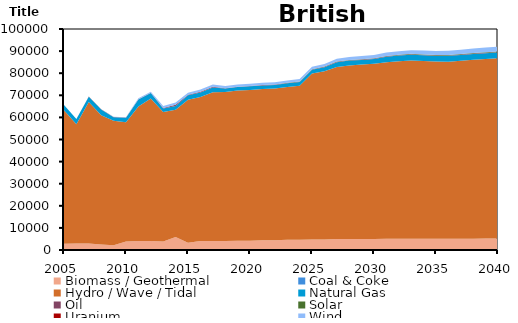
| Category | Biomass / Geothermal | Coal & Coke | Hydro / Wave / Tidal | Natural Gas | Oil | Solar | Uranium | Wind |
|---|---|---|---|---|---|---|---|---|
| 2005.0 | 2863.407 | 0 | 60327 | 2382.917 | 91.056 | 0 | 0 | 0 |
| 2006.0 | 2948.704 | 0 | 53902.91 | 2388.621 | 35.556 | 0 | 0 | 0 |
| 2007.0 | 2948.704 | 0 | 64015.8 | 2388.62 | 91.556 | 0 | 0 | 0 |
| 2008.0 | 2467.383 | 0 | 58525.63 | 2635.125 | 94.568 | 0 | 0 | 0 |
| 2009.0 | 2162.837 | 0 | 56298.4 | 1635.694 | 111.112 | 0 | 0 | 34 |
| 2010.0 | 3810.735 | 0 | 53970.88 | 2089.002 | 107.104 | 0 | 0 | 123 |
| 2011.0 | 4110.999 | 0 | 60772.07 | 3214.862 | 91.712 | 0 | 0 | 484.602 |
| 2012.0 | 4034.091 | 0 | 64477.04 | 2557.922 | 46.184 | 0 | 0 | 507.981 |
| 2013.0 | 3821.901 | 0 | 58666.27 | 1520.026 | 289.309 | 0 | 0 | 860 |
| 2014.0 | 5856.074 | 0 | 57572.87 | 1689.203 | 556.96 | 0 | 0 | 1071.139 |
| 2015.0 | 3275.062 | 0 | 64713.33 | 2050.774 | 196.85 | 0 | 0 | 867.895 |
| 2016.0 | 4030.003 | 0 | 65194.44 | 2077.94 | 304.474 | 0 | 0 | 1058.948 |
| 2017.0 | 4040.525 | 0 | 67340.4 | 2115.704 | 330.782 | 0 | 0 | 1015.417 |
| 2018.0 | 4040.524 | 0 | 67459.69 | 1528.177 | 160.6 | 7.008 | 0 | 1015.417 |
| 2019.0 | 4218.789 | 0 | 68009.38 | 1516.383 | 160.6 | 7.008 | 0 | 1015.417 |
| 2020.0 | 4218.789 | 0 | 68221.81 | 1634.319 | 160.6 | 7.008 | 0 | 1015.417 |
| 2021.0 | 4397.053 | 0 | 68434.27 | 1634.32 | 160.6 | 20.148 | 0 | 1015.417 |
| 2022.0 | 4397.053 | 0 | 68646.69 | 1636.05 | 160.6 | 33.288 | 0 | 1050.457 |
| 2023.0 | 4590.691 | 0 | 69206.12 | 1647.177 | 160.6 | 53.436 | 0 | 1085.497 |
| 2024.0 | 4607.169 | 0 | 69744.25 | 1655.513 | 160.6 | 66.576 | 0 | 1120.537 |
| 2025.0 | 4753.581 | 0 | 75147.2 | 1660.6 | 160.6 | 79.716 | 0 | 1155.577 |
| 2026.0 | 4784.433 | 0 | 76111.87 | 1849.27 | 160.6 | 92.856 | 0 | 1190.617 |
| 2027.0 | 4985.819 | 0 | 77794.23 | 2223.952 | 172.689 | 105.996 | 0 | 1269.458 |
| 2028.0 | 5005.484 | 0 | 78489.21 | 2242.826 | 164.105 | 126.144 | 0 | 1348.298 |
| 2029.0 | 5008.357 | 0 | 78892.54 | 2125.525 | 160.6 | 139.284 | 0 | 1427.136 |
| 2030.0 | 5019.908 | 0 | 79305.02 | 2139.751 | 170.722 | 152.424 | 0 | 1462.177 |
| 2031.0 | 5062.909 | 0 | 79842.62 | 2538.719 | 170.688 | 165.564 | 0 | 1541.018 |
| 2032.0 | 5092.802 | 0 | 80329.57 | 2575.352 | 160.6 | 178.704 | 0 | 1576.057 |
| 2033.0 | 5120.564 | 0 | 80657.79 | 2608.667 | 178.75 | 198.852 | 0 | 1654.898 |
| 2034.0 | 5101.451 | 0 | 80431.36 | 2561.362 | 175.727 | 211.992 | 0 | 1733.737 |
| 2035.0 | 5110.105 | 0 | 80159.71 | 2556.11 | 172.689 | 225.132 | 0 | 1812.576 |
| 2036.0 | 5119.872 | 0 | 80115.37 | 2621.646 | 168.619 | 238.272 | 0 | 1891.416 |
| 2037.0 | 5130.087 | 0 | 80518.27 | 2619.398 | 160.6 | 251.412 | 0 | 1970.258 |
| 2038.0 | 5141.836 | 0 | 80952.3 | 2616.25 | 160.6 | 271.56 | 0 | 2049.097 |
| 2039.0 | 5155.065 | 0 | 81295.27 | 2617.833 | 160.6 | 284.7 | 0 | 2127.938 |
| 2040.0 | 5169.254 | 0 | 81580.35 | 2620.94 | 162.633 | 297.84 | 0 | 2206.776 |